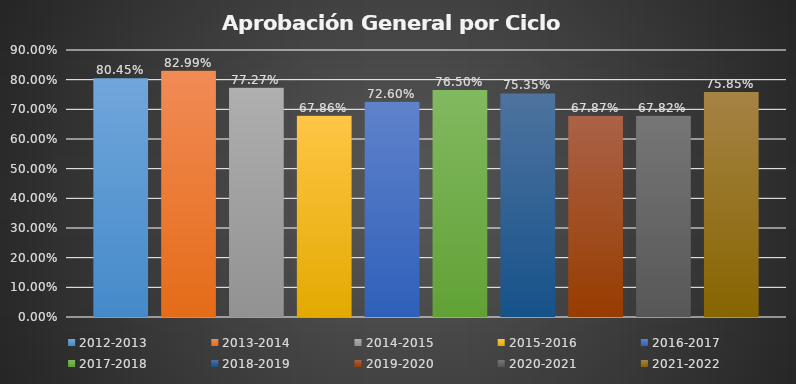
| Category | 2012-2013 | 2013-2014 | 2014-2015 | 2015-2016  | 2016-2017 | 2017-2018 | 2018-2019 | 2019-2020 | 2020-2021 | 2021-2022 |
|---|---|---|---|---|---|---|---|---|---|---|
| 0 | 0.804 | 0.83 | 0.773 | 0.679 | 0.726 | 0.765 | 0.754 | 0.679 | 0.678 | 0.758 |